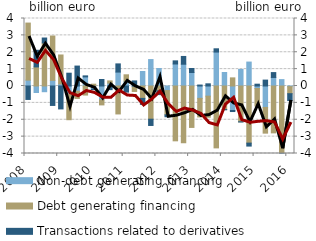
| Category | Non-debt generating financing | Debt generating financing | Transactions related to derivatives |
|---|---|---|---|
| 2008.0 | 0.348 | 3.381 | -0.797 |
| 2008.0 | -0.385 | 1.131 | 0.986 |
| 2008.0 | -0.338 | 2.551 | 0.292 |
| 2008.0 | 0.334 | 2.628 | -1.152 |
| 2009.0 | 0.125 | 1.714 | -1.358 |
| 2009.0 | -0.495 | -1.502 | 0.758 |
| 2009.0 | -0.31 | -0.426 | 1.181 |
| 2009.0 | 0.54 | -0.537 | 0.06 |
| 2010.0 | -0.188 | 0.108 | -0.028 |
| 2010.0 | -0.819 | -0.301 | 0.384 |
| 2010.0 | 0.167 | 0.134 | -0.216 |
| 2010.0 | 0.825 | -1.656 | 0.485 |
| 2011.0 | 0.28 | 0.384 | -0.362 |
| 2011.0 | -0.045 | -0.279 | 0.301 |
| 2011.0 | 0.858 | -0.734 | -0.355 |
| 2011.0 | 1.566 | -1.967 | -0.372 |
| 2012.0 | 1.038 | -0.282 | -0.228 |
| 2012.0 | -0.271 | -1.439 | -0.112 |
| 2012.0 | 1.304 | -3.249 | 0.185 |
| 2012.0 | 1.29 | -3.363 | 0.461 |
| 2013.0 | 0.8 | -2.455 | 0.238 |
| 2013.0 | -0.732 | -1.101 | 0.057 |
| 2013.0 | -0.602 | -1.25 | 0.129 |
| 2013.0 | 2.011 | -3.667 | 0.193 |
| 2014.0 | 0.8 | -1.395 | -0.015 |
| 2014.0 | -1.451 | 0.481 | -0.062 |
| 2014.0 | 0.982 | -2.12 | -0.012 |
| 2014.0 | 1.418 | -3.385 | -0.175 |
| 2015.0 | -0.149 | -1.04 | 0.108 |
| 2015.0 | -1.27 | -1.524 | 0.349 |
| 2015.0 | 0.506 | -2.778 | 0.289 |
| 2015.0 | 0.378 | -4.031 | -0.059 |
| 2016.0 | -0.037 | -0.419 | -0.406 |